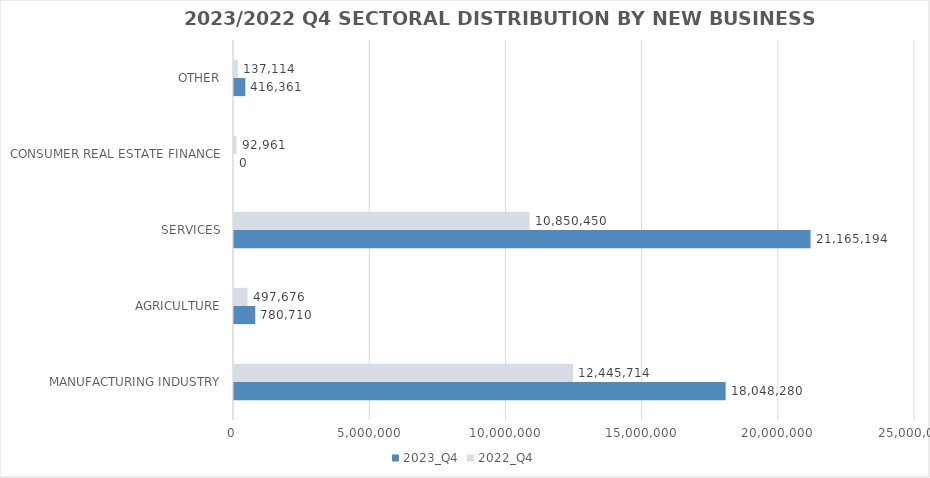
| Category | 2023_Q4 | 2022_Q4 |
|---|---|---|
| MANUFACTURING INDUSTRY | 18048280.115 | 12445714.012 |
| AGRICULTURE | 780710.371 | 497676.166 |
| SERVICES | 21165193.629 | 10850450.24 |
| CONSUMER REAL ESTATE FINANCE | 0 | 92961 |
| OTHER | 416361 | 137114 |